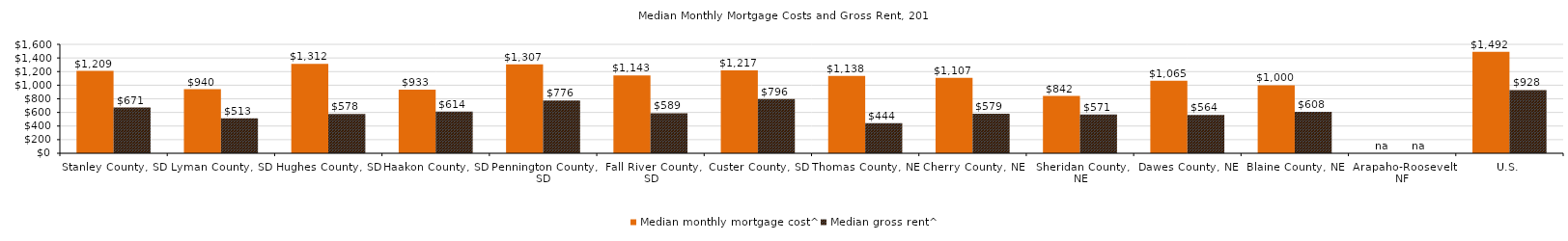
| Category | Median monthly mortgage cost^ | Median gross rent^ |
|---|---|---|
| Gallatin County, MT | 1588 | 831 |
| County Region | 1588 | 831 |
| U.S. | 1559 | 889 |